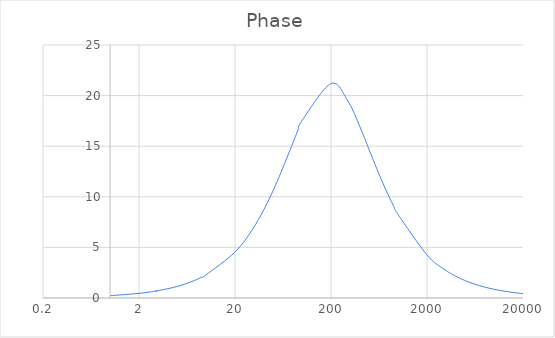
| Category | Phase |
|---|---|
| 1.0 | 0.229 |
| 2.0 | 0.459 |
| 3.0 | 0.688 |
| 3.0 | 0.688 |
| 4.0 | 0.917 |
| 5.0 | 1.146 |
| 6.0 | 1.375 |
| 7.0 | 1.604 |
| 8.0 | 1.832 |
| 9.0 | 2.06 |
| 10.0 | 2.287 |
| 20.0 | 4.531 |
| 30.0 | 6.691 |
| 40.0 | 8.734 |
| 50.0 | 10.632 |
| 60.0 | 12.365 |
| 70.0 | 13.925 |
| 80.0 | 15.306 |
| 90.0 | 16.51 |
| 100.0 | 17.545 |
| 200.0 | 21.187 |
| 300.0 | 19.465 |
| 400.0 | 16.922 |
| 500.0 | 14.642 |
| 600.0 | 12.776 |
| 700.0 | 11.274 |
| 800.0 | 10.059 |
| 900.0 | 9.064 |
| 1000.0 | 8.239 |
| 2000.0 | 4.256 |
| 3000.0 | 2.855 |
| 4000.0 | 2.146 |
| 5000.0 | 1.718 |
| 6000.0 | 1.433 |
| 7000.0 | 1.229 |
| 8000.0 | 1.075 |
| 9000.0 | 0.956 |
| 10000.0 | 0.86 |
| 11000.0 | 0.782 |
| 12000.0 | 0.717 |
| 13000.0 | 0.662 |
| 14000.0 | 0.615 |
| 15000.0 | 0.574 |
| 16000.0 | 0.538 |
| 17000.0 | 0.506 |
| 18000.0 | 0.478 |
| 19000.0 | 0.453 |
| 20000.0 | 0.43 |